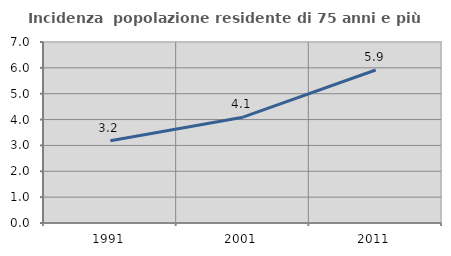
| Category | Incidenza  popolazione residente di 75 anni e più |
|---|---|
| 1991.0 | 3.179 |
| 2001.0 | 4.094 |
| 2011.0 | 5.917 |